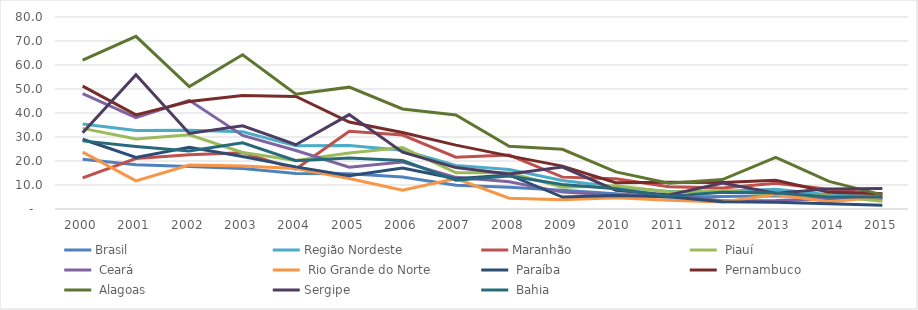
| Category | Brasil | Região Nordeste | Maranhão |  Piauí |  Ceará |  Rio Grande do Norte |  Paraíba |  Pernambuco |  Alagoas | Sergipe |  Bahia |
|---|---|---|---|---|---|---|---|---|---|---|---|
| 2000.0 | 20.774 | 35.45 | 12.936 | 33.602 | 48.103 | 23.707 | 29.053 | 51.189 | 62.057 | 31.733 | 28.383 |
| 2001.0 | 18.455 | 32.662 | 21.017 | 29.181 | 38.114 | 11.731 | 21.507 | 39.217 | 71.918 | 55.936 | 26.062 |
| 2002.0 | 17.736 | 32.793 | 22.643 | 30.885 | 45.265 | 18.297 | 25.691 | 44.783 | 50.996 | 31.483 | 24.192 |
| 2003.0 | 16.896 | 32.184 | 23.47 | 23.565 | 30.63 | 17.895 | 21.876 | 47.33 | 64.273 | 34.664 | 27.614 |
| 2004.0 | 14.761 | 26.308 | 16.633 | 20.214 | 24.362 | 16.916 | 17.551 | 46.918 | 47.805 | 26.779 | 20.147 |
| 2005.0 | 14.668 | 26.46 | 32.408 | 23.294 | 17.433 | 12.681 | 13.843 | 36.214 | 50.767 | 39.334 | 21.263 |
| 2006.0 | 13.35 | 24.468 | 30.793 | 25.593 | 19.605 | 7.783 | 17.065 | 31.837 | 41.7 | 23.689 | 20.193 |
| 2007.0 | 9.922 | 18.172 | 21.577 | 15.143 | 13.189 | 12.698 | 12.618 | 26.627 | 39.154 | 17.262 | 12.015 |
| 2008.0 | 9.045 | 16.455 | 22.495 | 15.148 | 11.39 | 4.526 | 14.192 | 22.132 | 26.174 | 14.59 | 13.734 |
| 2009.0 | 7.838 | 11.866 | 13.28 | 9.107 | 7.041 | 3.887 | 4.98 | 17.876 | 24.864 | 17.444 | 10.215 |
| 2010.0 | 6.354 | 9.147 | 12.64 | 9.691 | 5.712 | 4.662 | 5.637 | 10.935 | 15.473 | 7.843 | 8.405 |
| 2011.0 | 4.85 | 7.259 | 9.285 | 7.112 | 5.682 | 3.64 | 5.115 | 11.127 | 10.748 | 5.857 | 5.324 |
| 2012.0 | 5.161 | 7.393 | 8.756 | 7.682 | 3.443 | 2.956 | 3.055 | 11.064 | 12.281 | 10.835 | 6.979 |
| 2013.0 | 5.539 | 8.277 | 10.773 | 6.025 | 3.503 | 5.999 | 2.795 | 11.934 | 21.482 | 6.608 | 6.771 |
| 2014.0 | 4.82 | 5.962 | 8.252 | 5.426 | 4.274 | 3.043 | 2.212 | 6.96 | 11.489 | 8.385 | 5.021 |
| 2015.0 | 4.2 | 5.233 | 6.214 | 3.187 | 4.777 | 5.012 | 1.608 | 6.386 | 5.869 | 8.5 | 5.025 |